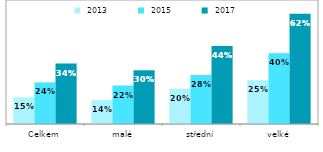
| Category |  2013 |  2015 |  2017 |
|---|---|---|---|
| Celkem | 0.15 | 0.235 | 0.341 |
| malé | 0.135 | 0.217 | 0.304 |
| střední | 0.199 | 0.276 | 0.441 |
| velké | 0.247 | 0.399 | 0.623 |